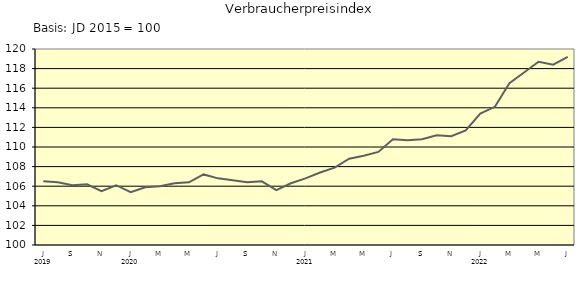
| Category | Series 0 |
|---|---|
| 0 | 106.5 |
| 1 | 106.4 |
| 2 | 106.1 |
| 3 | 106.2 |
| 4 | 105.5 |
| 5 | 106.1 |
| 6 | 105.4 |
| 7 | 105.9 |
| 8 | 106 |
| 9 | 106.3 |
| 10 | 106.4 |
| 11 | 107.2 |
| 12 | 106.8 |
| 13 | 106.6 |
| 14 | 106.4 |
| 15 | 106.5 |
| 16 | 105.6 |
| 17 | 106.3 |
| 18 | 106.8 |
| 19 | 107.4 |
| 20 | 107.9 |
| 21 | 108.8 |
| 22 | 109.1 |
| 23 | 109.5 |
| 24 | 110.8 |
| 25 | 110.7 |
| 26 | 110.8 |
| 27 | 111.2 |
| 28 | 111.1 |
| 29 | 111.7 |
| 30 | 113.4 |
| 31 | 114.1 |
| 32 | 116.5 |
| 33 | 117.6 |
| 34 | 118.7 |
| 35 | 118.4 |
| 36 | 119.2 |